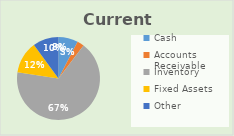
| Category | Series 0 |
|---|---|
| Cash | 15500 |
| Accounts Receivable | 5500 |
| Inventory | 136500 |
| Fixed Assets | 25500 |
| Other | 20500 |